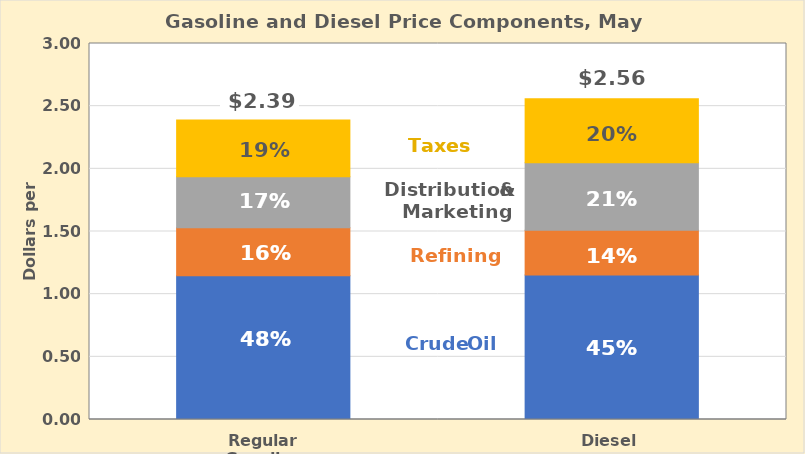
| Category | Crude Oil | Refining | Distribution & Marketing | Taxes |
|---|---|---|---|---|
| Regular Gasoline | 1.147 | 0.382 | 0.406 | 0.454 |
| Diesel | 1.152 | 0.358 | 0.538 | 0.512 |